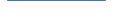
| Category | Series 0 |
|---|---|
| 0 | 92 |
| 1 | 85 |
| 2 | 84 |
| 3 | 68 |
| 4 | 98 |
| 5 | 83 |
| 6 | 73 |
| 7 | 81 |
| 8 | 68 |